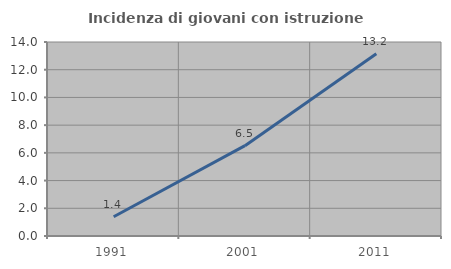
| Category | Incidenza di giovani con istruzione universitaria |
|---|---|
| 1991.0 | 1.393 |
| 2001.0 | 6.52 |
| 2011.0 | 13.151 |